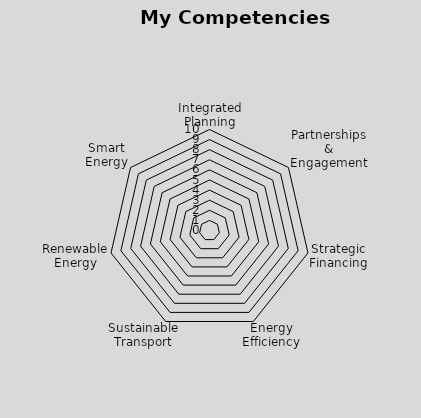
| Category | Series 0 |
|---|---|
| Integrated Planning | 0 |
| Partnerships & Engagement | 0 |
| Strategic Financing | 0 |
| Energy Efficiency | 0 |
| Sustainable Transport | 0 |
| Renewable Energy | 0 |
| Smart Energy | 0 |